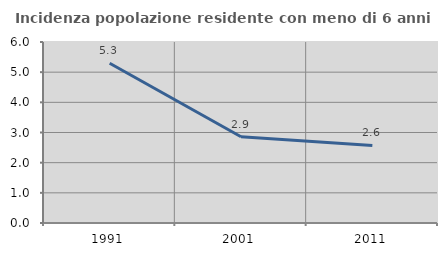
| Category | Incidenza popolazione residente con meno di 6 anni |
|---|---|
| 1991.0 | 5.297 |
| 2001.0 | 2.857 |
| 2011.0 | 2.571 |